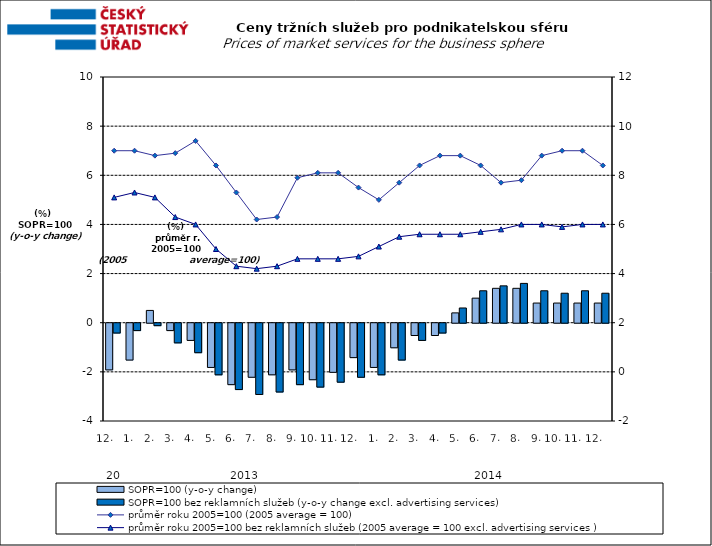
| Category | SOPR=100 (y-o-y change)   | SOPR=100 bez reklamních služeb (y-o-y change excl. advertising services)   |
|---|---|---|
| 0 | -1.9 | -0.4 |
| 1 | -1.5 | -0.3 |
| 2 | 0.5 | -0.1 |
| 3 | -0.3 | -0.8 |
| 4 | -0.7 | -1.2 |
| 5 | -1.8 | -2.1 |
| 6 | -2.5 | -2.7 |
| 7 | -2.2 | -2.9 |
| 8 | -2.1 | -2.8 |
| 9 | -1.9 | -2.5 |
| 10 | -2.3 | -2.6 |
| 11 | -2 | -2.4 |
| 12 | -1.4 | -2.2 |
| 13 | -1.8 | -2.1 |
| 14 | -1 | -1.5 |
| 15 | -0.5 | -0.7 |
| 16 | -0.5 | -0.4 |
| 17 | 0.4 | 0.6 |
| 18 | 1 | 1.3 |
| 19 | 1.4 | 1.5 |
| 20 | 1.4 | 1.6 |
| 21 | 0.8 | 1.3 |
| 22 | 0.8 | 1.2 |
| 23 | 0.8 | 1.3 |
| 24 | 0.8 | 1.2 |